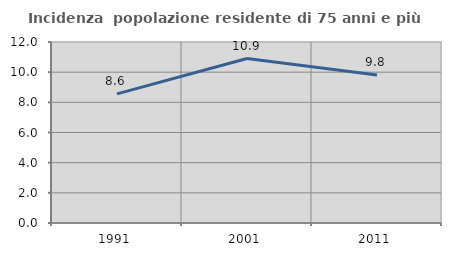
| Category | Incidenza  popolazione residente di 75 anni e più |
|---|---|
| 1991.0 | 8.563 |
| 2001.0 | 10.904 |
| 2011.0 | 9.806 |